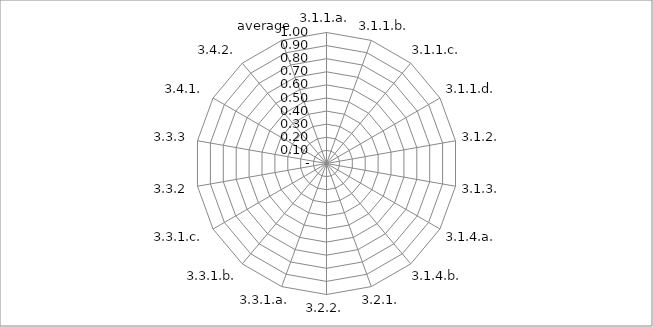
| Category | Series 0 |
|---|---|
| 3.1.1.a. | 0 |
| 3.1.1.b. | 0 |
| 3.1.1.c. | 0 |
| 3.1.1.d. | 0 |
| 3.1.2. | 0 |
| 3.1.3. | 0 |
| 3.1.4.a. | 0 |
| 3.1.4.b. | 0 |
| 3.2.1. | 0 |
| 3.2.2. | 0 |
| 3.3.1.a. | 0 |
| 3.3.1.b. | 0 |
| 3.3.1.c. | 0 |
| 3.3.2 | 0 |
| 3.3.3 | 0 |
| 3.4.1. | 0 |
| 3.4.2. | 0 |
| average | 0 |